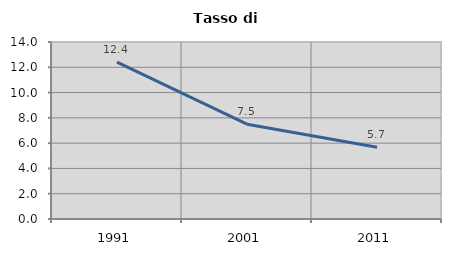
| Category | Tasso di disoccupazione   |
|---|---|
| 1991.0 | 12.403 |
| 2001.0 | 7.501 |
| 2011.0 | 5.67 |